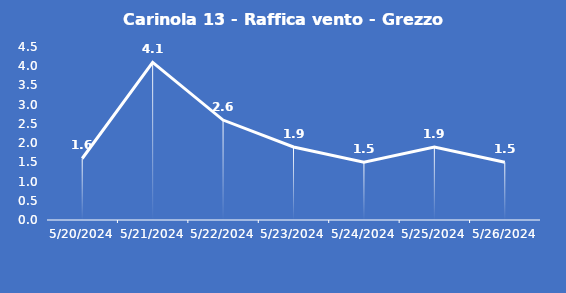
| Category | Carinola 13 - Raffica vento - Grezzo (m/s) |
|---|---|
| 5/20/24 | 1.6 |
| 5/21/24 | 4.1 |
| 5/22/24 | 2.6 |
| 5/23/24 | 1.9 |
| 5/24/24 | 1.5 |
| 5/25/24 | 1.9 |
| 5/26/24 | 1.5 |